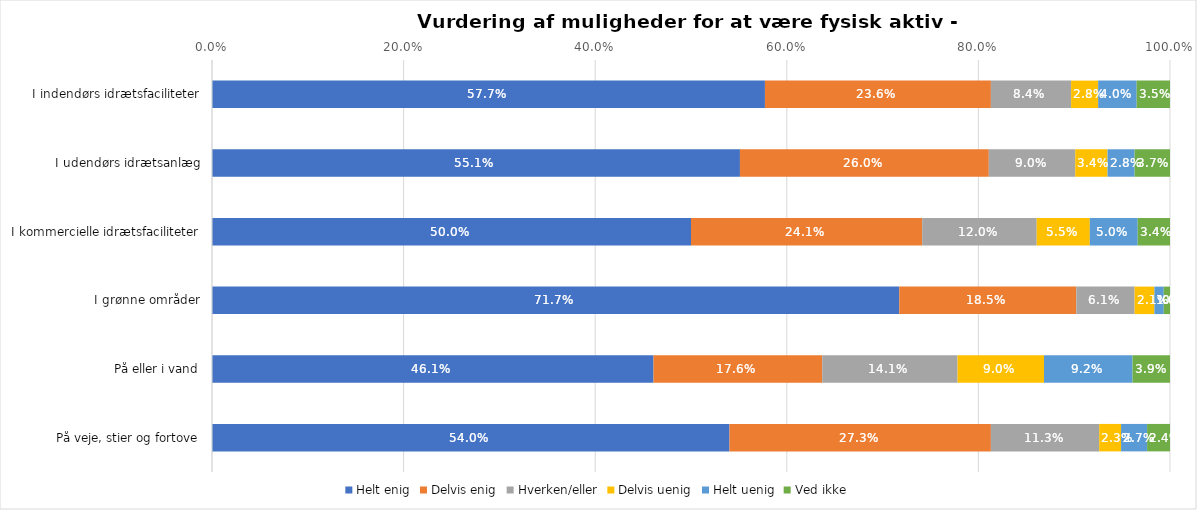
| Category | Helt enig | Delvis enig | Hverken/eller | Delvis uenig | Helt uenig | Ved ikke |
|---|---|---|---|---|---|---|
| I indendørs idrætsfaciliteter | 0.577 | 0.236 | 0.084 | 0.028 | 0.04 | 0.035 |
| I udendørs idrætsanlæg | 0.551 | 0.26 | 0.09 | 0.034 | 0.028 | 0.037 |
| I kommercielle idrætsfaciliteter | 0.5 | 0.241 | 0.12 | 0.055 | 0.05 | 0.034 |
| I grønne områder | 0.717 | 0.185 | 0.061 | 0.021 | 0.01 | 0.007 |
| På eller i vand | 0.461 | 0.176 | 0.141 | 0.09 | 0.092 | 0.039 |
| På veje, stier og fortove | 0.54 | 0.273 | 0.113 | 0.023 | 0.027 | 0.024 |